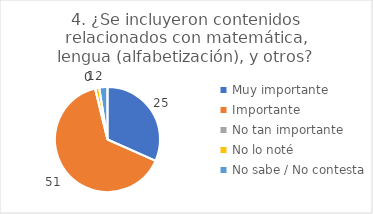
| Category | 4. ¿Se incluyeron contenidos relacionados con matemática, lengua (alfabetización), y otros? |
|---|---|
| Muy importante  | 0.316 |
| Importante  | 0.646 |
| No tan importante  | 0 |
| No lo noté  | 0.013 |
| No sabe / No contesta | 0.025 |